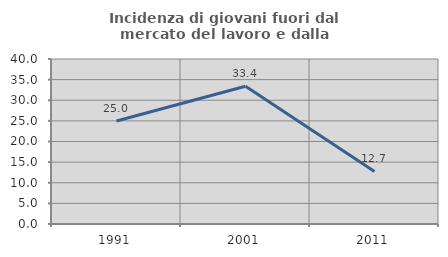
| Category | Incidenza di giovani fuori dal mercato del lavoro e dalla formazione  |
|---|---|
| 1991.0 | 24.971 |
| 2001.0 | 33.383 |
| 2011.0 | 12.745 |